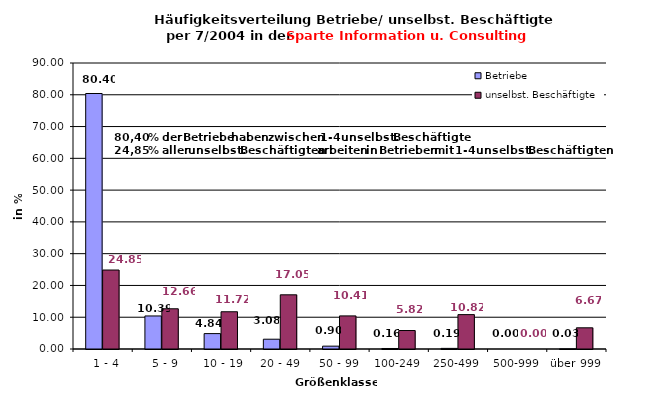
| Category | Betriebe | unselbst. Beschäftigte |
|---|---|---|
|   1 - 4 | 80.398 | 24.854 |
|   5 - 9 | 10.395 | 12.659 |
|  10 - 19 | 4.844 | 11.72 |
| 20 - 49 | 3.08 | 17.049 |
| 50 - 99 | 0.898 | 10.413 |
| 100-249 | 0.16 | 5.816 |
| 250-499 | 0.192 | 10.817 |
| 500-999 | 0 | 0 |
| über 999 | 0.032 | 6.671 |